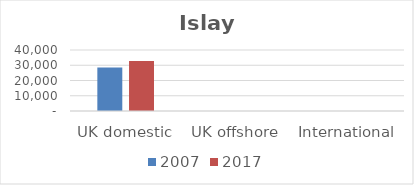
| Category | 2007 | 2017 |
|---|---|---|
| UK domestic | 28532 | 32743 |
| UK offshore | 0 | 0 |
| International | 0 | 0 |